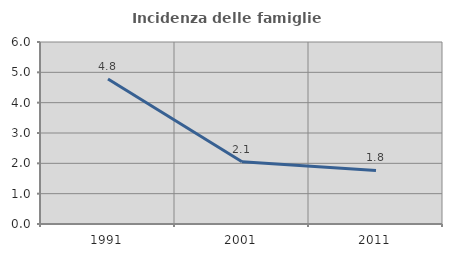
| Category | Incidenza delle famiglie numerose |
|---|---|
| 1991.0 | 4.778 |
| 2001.0 | 2.054 |
| 2011.0 | 1.764 |